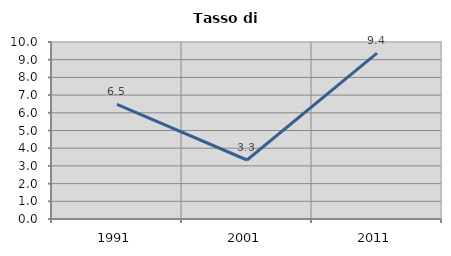
| Category | Tasso di disoccupazione   |
|---|---|
| 1991.0 | 6.481 |
| 2001.0 | 3.333 |
| 2011.0 | 9.375 |